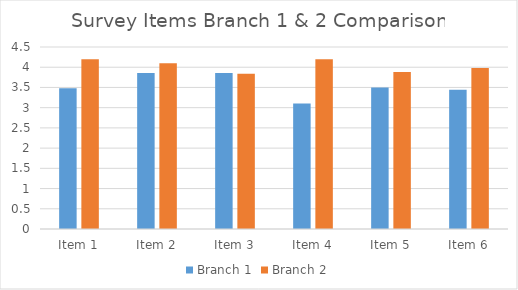
| Category | Branch 1 | Branch 2 |
|---|---|---|
| Item 1 | 3.48 | 4.2 |
| Item 2 | 3.86 | 4.1 |
| Item 3 | 3.86 | 3.84 |
| Item 4 | 3.1 | 4.2 |
| Item 5 | 3.5 | 3.88 |
| Item 6 | 3.44 | 3.98 |